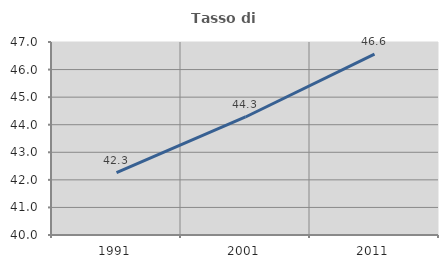
| Category | Tasso di occupazione   |
|---|---|
| 1991.0 | 42.262 |
| 2001.0 | 44.281 |
| 2011.0 | 46.559 |